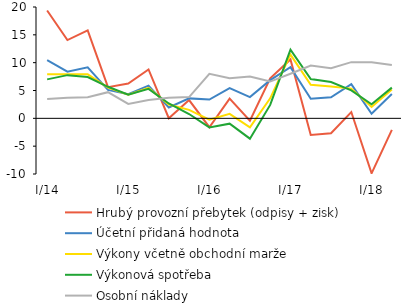
| Category | Hrubý provozní přebytek (odpisy + zisk)   | Účetní přidaná hodnota | Výkony včetně obchodní marže | Výkonová spotřeba | Osobní náklady |
|---|---|---|---|---|---|
|  I/14 | 19.377 | 10.443 | 7.927 | 6.996 | 3.489 |
| II | 14.056 | 8.377 | 7.929 | 7.759 | 3.715 |
| III | 15.807 | 9.164 | 7.897 | 7.423 | 3.778 |
| IV | 5.608 | 5.099 | 5.518 | 5.667 | 4.703 |
|  I/15 | 6.258 | 4.33 | 4.267 | 4.242 | 2.6 |
|  II | 8.779 | 5.885 | 5.463 | 5.302 | 3.274 |
| III | 0.02 | 1.943 | 2.472 | 2.674 | 3.683 |
| IV | 3.287 | 3.585 | 1.515 | 0.78 | 3.819 |
|  I/16 | -1.596 | 3.373 | -0.248 | -1.632 | 7.994 |
| II | 3.541 | 5.412 | 0.805 | -0.957 | 7.192 |
| III | -0.43 | 3.809 | -1.61 | -3.654 | 7.507 |
| IV | 7.176 | 6.856 | 3.599 | 2.411 | 6.605 |
|  I/17 | 10.577 | 9.191 | 11.446 | 12.351 | 8.017 |
| II | -2.998 | 3.514 | 6.043 | 7.072 | 9.495 |
| III | -2.678 | 3.78 | 5.728 | 6.519 | 9 |
| IV | 1.133 | 6.149 | 5.336 | 5.027 | 10.09 |
|  I/18 | -9.879 | 0.811 | 2.053 | 2.538 | 10.082 |
| II | -2.066 | 4.367 | 5.192 | 5.516 | 9.601 |